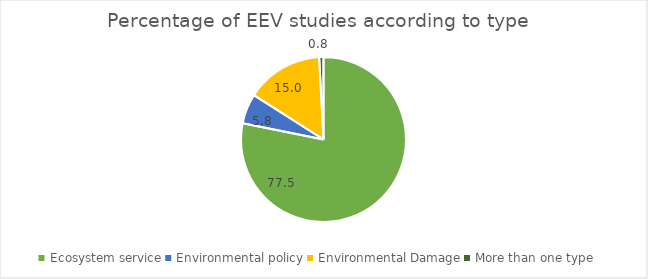
| Category | Percentage |
|---|---|
| Ecosystem service | 77.5 |
| Environmental policy | 5.833 |
| Environmental Damage | 15 |
| More than one type  | 0.833 |